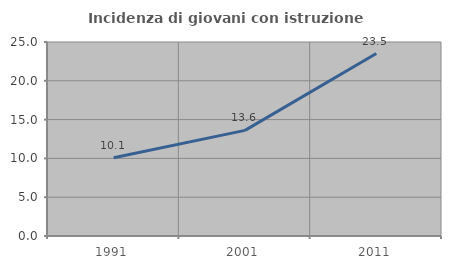
| Category | Incidenza di giovani con istruzione universitaria |
|---|---|
| 1991.0 | 10.093 |
| 2001.0 | 13.609 |
| 2011.0 | 23.508 |